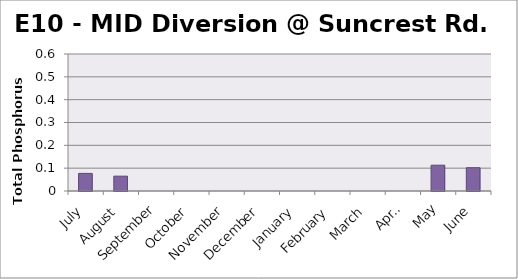
| Category | Phosphorus (mg/L) |
|---|---|
| July | 0.077 |
| August | 0.065 |
| September | 0 |
| October | 0 |
| November | 0 |
| December | 0 |
| January | 0 |
| February | 0 |
| March | 0 |
| April | 0 |
| May | 0.113 |
| June | 0.102 |